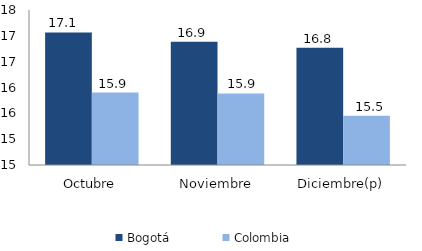
| Category | Bogotá | Colombia |
|---|---|---|
| Octubre | 17.065 | 15.901 |
| Noviembre | 16.884 | 15.884 |
| Diciembre(p) | 16.771 | 15.453 |